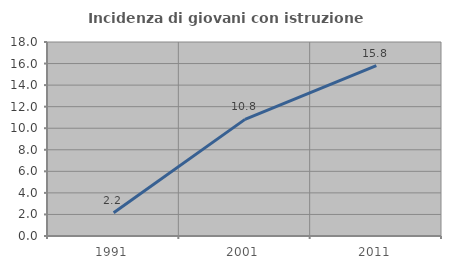
| Category | Incidenza di giovani con istruzione universitaria |
|---|---|
| 1991.0 | 2.155 |
| 2001.0 | 10.82 |
| 2011.0 | 15.812 |